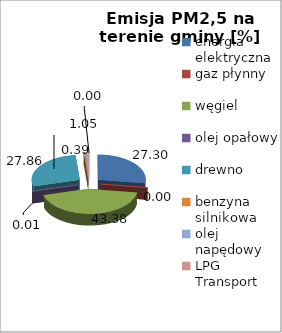
| Category | 27,30 0,00 43,38 0,01 27,86 0,39 1,05 0,00 |
|---|---|
| energia elektryczna | 27.302 |
| gaz płynny | 0.003 |
| węgiel | 43.384 |
| olej opałowy | 0.009 |
| drewno | 27.857 |
| benzyna silnikowa | 0.391 |
| olej napędowy | 1.054 |
| LPG Transport | 0 |